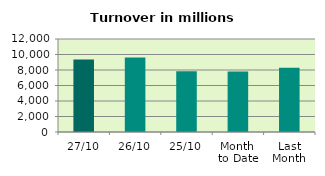
| Category | Series 0 |
|---|---|
| 27/10 | 9364.339 |
| 26/10 | 9599.826 |
| 25/10 | 7826.452 |
| Month 
to Date | 7810.828 |
| Last
Month | 8284.199 |